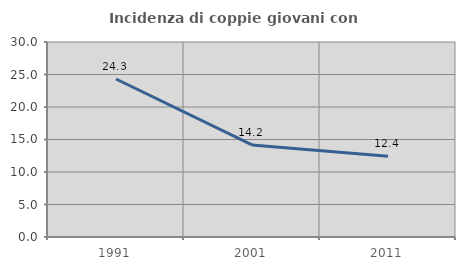
| Category | Incidenza di coppie giovani con figli |
|---|---|
| 1991.0 | 24.308 |
| 2001.0 | 14.167 |
| 2011.0 | 12.439 |